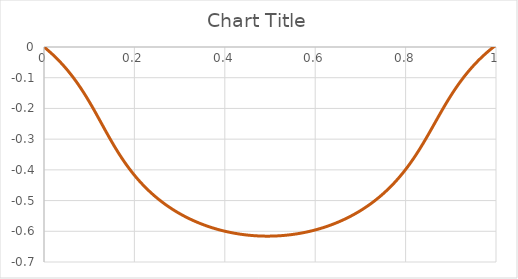
| Category | Series 0 |
|---|---|
| 0.0 | 0 |
| 0.001 | -0.001 |
| 0.002 | -0.002 |
| 0.003 | -0.004 |
| 0.004 | -0.005 |
| 0.005 | -0.006 |
| 0.006 | -0.007 |
| 0.007 | -0.009 |
| 0.008 | -0.01 |
| 0.009000000000000001 | -0.011 |
| 0.01 | -0.012 |
| 0.011 | -0.014 |
| 0.012 | -0.015 |
| 0.013000000000000001 | -0.016 |
| 0.014 | -0.018 |
| 0.015 | -0.019 |
| 0.016 | -0.02 |
| 0.017 | -0.022 |
| 0.018000000000000002 | -0.023 |
| 0.019 | -0.024 |
| 0.02 | -0.026 |
| 0.021 | -0.027 |
| 0.022 | -0.028 |
| 0.023 | -0.03 |
| 0.024 | -0.031 |
| 0.025 | -0.033 |
| 0.026000000000000002 | -0.034 |
| 0.027 | -0.036 |
| 0.028 | -0.037 |
| 0.029 | -0.038 |
| 0.03 | -0.04 |
| 0.031 | -0.041 |
| 0.032 | -0.043 |
| 0.033 | -0.045 |
| 0.034 | -0.046 |
| 0.035 | -0.048 |
| 0.036000000000000004 | -0.049 |
| 0.037 | -0.051 |
| 0.038 | -0.052 |
| 0.039 | -0.054 |
| 0.04 | -0.055 |
| 0.041 | -0.057 |
| 0.042 | -0.059 |
| 0.043000000000000003 | -0.06 |
| 0.044 | -0.062 |
| 0.045 | -0.064 |
| 0.046 | -0.065 |
| 0.047 | -0.067 |
| 0.048 | -0.069 |
| 0.049 | -0.07 |
| 0.05 | -0.072 |
| 0.051000000000000004 | -0.074 |
| 0.052000000000000005 | -0.076 |
| 0.053 | -0.078 |
| 0.054 | -0.079 |
| 0.055 | -0.081 |
| 0.056 | -0.083 |
| 0.057 | -0.085 |
| 0.058 | -0.087 |
| 0.059000000000000004 | -0.088 |
| 0.06 | -0.09 |
| 0.061 | -0.092 |
| 0.062 | -0.094 |
| 0.063 | -0.096 |
| 0.064 | -0.098 |
| 0.065 | -0.1 |
| 0.066 | -0.102 |
| 0.067 | -0.104 |
| 0.068 | -0.106 |
| 0.069 | -0.108 |
| 0.07 | -0.11 |
| 0.07100000000000001 | -0.112 |
| 0.07200000000000001 | -0.114 |
| 0.073 | -0.116 |
| 0.074 | -0.118 |
| 0.075 | -0.12 |
| 0.076 | -0.122 |
| 0.077 | -0.125 |
| 0.078 | -0.127 |
| 0.079 | -0.129 |
| 0.08 | -0.131 |
| 0.081 | -0.133 |
| 0.082 | -0.135 |
| 0.083 | -0.138 |
| 0.084 | -0.14 |
| 0.085 | -0.142 |
| 0.08600000000000001 | -0.144 |
| 0.08700000000000001 | -0.147 |
| 0.088 | -0.149 |
| 0.089 | -0.151 |
| 0.09 | -0.154 |
| 0.091 | -0.156 |
| 0.092 | -0.158 |
| 0.093 | -0.161 |
| 0.094 | -0.163 |
| 0.095 | -0.166 |
| 0.096 | -0.168 |
| 0.097 | -0.17 |
| 0.098 | -0.173 |
| 0.099 | -0.175 |
| 0.1 | -0.178 |
| 0.101 | -0.18 |
| 0.10200000000000001 | -0.183 |
| 0.10300000000000001 | -0.185 |
| 0.10400000000000001 | -0.188 |
| 0.105 | -0.19 |
| 0.106 | -0.193 |
| 0.107 | -0.196 |
| 0.108 | -0.198 |
| 0.109 | -0.201 |
| 0.11 | -0.203 |
| 0.111 | -0.206 |
| 0.112 | -0.208 |
| 0.113 | -0.211 |
| 0.114 | -0.214 |
| 0.115 | -0.216 |
| 0.116 | -0.219 |
| 0.117 | -0.222 |
| 0.11800000000000001 | -0.224 |
| 0.11900000000000001 | -0.227 |
| 0.12 | -0.23 |
| 0.121 | -0.232 |
| 0.122 | -0.235 |
| 0.123 | -0.238 |
| 0.124 | -0.24 |
| 0.125 | -0.243 |
| 0.126 | -0.246 |
| 0.127 | -0.248 |
| 0.128 | -0.251 |
| 0.129 | -0.254 |
| 0.13 | -0.256 |
| 0.131 | -0.259 |
| 0.132 | -0.262 |
| 0.133 | -0.264 |
| 0.134 | -0.267 |
| 0.135 | -0.27 |
| 0.136 | -0.272 |
| 0.137 | -0.275 |
| 0.138 | -0.278 |
| 0.139 | -0.28 |
| 0.14 | -0.283 |
| 0.14100000000000001 | -0.286 |
| 0.14200000000000002 | -0.288 |
| 0.14300000000000002 | -0.291 |
| 0.14400000000000002 | -0.293 |
| 0.145 | -0.296 |
| 0.146 | -0.299 |
| 0.147 | -0.301 |
| 0.148 | -0.304 |
| 0.149 | -0.306 |
| 0.15 | -0.309 |
| 0.151 | -0.311 |
| 0.152 | -0.314 |
| 0.153 | -0.316 |
| 0.154 | -0.319 |
| 0.155 | -0.321 |
| 0.156 | -0.324 |
| 0.157 | -0.326 |
| 0.158 | -0.329 |
| 0.159 | -0.331 |
| 0.16 | -0.334 |
| 0.161 | -0.336 |
| 0.162 | -0.338 |
| 0.163 | -0.341 |
| 0.164 | -0.343 |
| 0.165 | -0.345 |
| 0.166 | -0.348 |
| 0.167 | -0.35 |
| 0.168 | -0.352 |
| 0.169 | -0.355 |
| 0.17 | -0.357 |
| 0.171 | -0.359 |
| 0.17200000000000001 | -0.361 |
| 0.17300000000000001 | -0.364 |
| 0.17400000000000002 | -0.366 |
| 0.17500000000000002 | -0.368 |
| 0.176 | -0.37 |
| 0.177 | -0.372 |
| 0.178 | -0.374 |
| 0.179 | -0.376 |
| 0.18 | -0.379 |
| 0.181 | -0.381 |
| 0.182 | -0.383 |
| 0.183 | -0.385 |
| 0.184 | -0.387 |
| 0.185 | -0.389 |
| 0.186 | -0.391 |
| 0.187 | -0.393 |
| 0.188 | -0.395 |
| 0.189 | -0.397 |
| 0.19 | -0.399 |
| 0.191 | -0.401 |
| 0.192 | -0.403 |
| 0.193 | -0.404 |
| 0.194 | -0.406 |
| 0.195 | -0.408 |
| 0.196 | -0.41 |
| 0.197 | -0.412 |
| 0.198 | -0.414 |
| 0.199 | -0.416 |
| 0.2 | -0.417 |
| 0.201 | -0.419 |
| 0.202 | -0.421 |
| 0.203 | -0.423 |
| 0.20400000000000001 | -0.424 |
| 0.20500000000000002 | -0.426 |
| 0.20600000000000002 | -0.428 |
| 0.20700000000000002 | -0.43 |
| 0.20800000000000002 | -0.431 |
| 0.209 | -0.433 |
| 0.21 | -0.435 |
| 0.211 | -0.436 |
| 0.212 | -0.438 |
| 0.213 | -0.44 |
| 0.214 | -0.441 |
| 0.215 | -0.443 |
| 0.216 | -0.444 |
| 0.217 | -0.446 |
| 0.218 | -0.447 |
| 0.219 | -0.449 |
| 0.22 | -0.451 |
| 0.221 | -0.452 |
| 0.222 | -0.454 |
| 0.223 | -0.455 |
| 0.224 | -0.457 |
| 0.225 | -0.458 |
| 0.226 | -0.46 |
| 0.227 | -0.461 |
| 0.228 | -0.462 |
| 0.229 | -0.464 |
| 0.23 | -0.465 |
| 0.231 | -0.467 |
| 0.232 | -0.468 |
| 0.233 | -0.469 |
| 0.234 | -0.471 |
| 0.23500000000000001 | -0.472 |
| 0.23600000000000002 | -0.474 |
| 0.23700000000000002 | -0.475 |
| 0.23800000000000002 | -0.476 |
| 0.23900000000000002 | -0.478 |
| 0.24 | -0.479 |
| 0.241 | -0.48 |
| 0.242 | -0.482 |
| 0.243 | -0.483 |
| 0.244 | -0.484 |
| 0.245 | -0.485 |
| 0.246 | -0.487 |
| 0.247 | -0.488 |
| 0.248 | -0.489 |
| 0.249 | -0.49 |
| 0.25 | -0.492 |
| 0.251 | -0.493 |
| 0.252 | -0.494 |
| 0.253 | -0.495 |
| 0.254 | -0.496 |
| 0.255 | -0.498 |
| 0.256 | -0.499 |
| 0.257 | -0.5 |
| 0.258 | -0.501 |
| 0.259 | -0.502 |
| 0.26 | -0.503 |
| 0.261 | -0.504 |
| 0.262 | -0.506 |
| 0.263 | -0.507 |
| 0.264 | -0.508 |
| 0.265 | -0.509 |
| 0.266 | -0.51 |
| 0.267 | -0.511 |
| 0.268 | -0.512 |
| 0.269 | -0.513 |
| 0.27 | -0.514 |
| 0.271 | -0.515 |
| 0.272 | -0.516 |
| 0.273 | -0.517 |
| 0.274 | -0.518 |
| 0.275 | -0.519 |
| 0.276 | -0.52 |
| 0.277 | -0.521 |
| 0.278 | -0.522 |
| 0.279 | -0.523 |
| 0.28 | -0.524 |
| 0.281 | -0.525 |
| 0.28200000000000003 | -0.526 |
| 0.28300000000000003 | -0.527 |
| 0.28400000000000003 | -0.528 |
| 0.28500000000000003 | -0.529 |
| 0.28600000000000003 | -0.53 |
| 0.28700000000000003 | -0.531 |
| 0.28800000000000003 | -0.532 |
| 0.289 | -0.533 |
| 0.29 | -0.534 |
| 0.291 | -0.535 |
| 0.292 | -0.535 |
| 0.293 | -0.536 |
| 0.294 | -0.537 |
| 0.295 | -0.538 |
| 0.296 | -0.539 |
| 0.297 | -0.54 |
| 0.298 | -0.541 |
| 0.299 | -0.542 |
| 0.3 | -0.542 |
| 0.301 | -0.543 |
| 0.302 | -0.544 |
| 0.303 | -0.545 |
| 0.304 | -0.546 |
| 0.305 | -0.546 |
| 0.306 | -0.547 |
| 0.307 | -0.548 |
| 0.308 | -0.549 |
| 0.309 | -0.55 |
| 0.31 | -0.55 |
| 0.311 | -0.551 |
| 0.312 | -0.552 |
| 0.313 | -0.553 |
| 0.314 | -0.553 |
| 0.315 | -0.554 |
| 0.316 | -0.555 |
| 0.317 | -0.556 |
| 0.318 | -0.556 |
| 0.319 | -0.557 |
| 0.32 | -0.558 |
| 0.321 | -0.559 |
| 0.322 | -0.559 |
| 0.323 | -0.56 |
| 0.324 | -0.561 |
| 0.325 | -0.561 |
| 0.326 | -0.562 |
| 0.327 | -0.563 |
| 0.328 | -0.563 |
| 0.329 | -0.564 |
| 0.33 | -0.565 |
| 0.331 | -0.565 |
| 0.332 | -0.566 |
| 0.333 | -0.567 |
| 0.334 | -0.567 |
| 0.335 | -0.568 |
| 0.336 | -0.569 |
| 0.337 | -0.569 |
| 0.338 | -0.57 |
| 0.339 | -0.571 |
| 0.34 | -0.571 |
| 0.341 | -0.572 |
| 0.342 | -0.572 |
| 0.343 | -0.573 |
| 0.34400000000000003 | -0.574 |
| 0.34500000000000003 | -0.574 |
| 0.34600000000000003 | -0.575 |
| 0.34700000000000003 | -0.575 |
| 0.34800000000000003 | -0.576 |
| 0.34900000000000003 | -0.577 |
| 0.35000000000000003 | -0.577 |
| 0.35100000000000003 | -0.578 |
| 0.352 | -0.578 |
| 0.353 | -0.579 |
| 0.354 | -0.579 |
| 0.355 | -0.58 |
| 0.356 | -0.58 |
| 0.357 | -0.581 |
| 0.358 | -0.581 |
| 0.359 | -0.582 |
| 0.36 | -0.583 |
| 0.361 | -0.583 |
| 0.362 | -0.584 |
| 0.363 | -0.584 |
| 0.364 | -0.585 |
| 0.365 | -0.585 |
| 0.366 | -0.586 |
| 0.367 | -0.586 |
| 0.368 | -0.587 |
| 0.369 | -0.587 |
| 0.37 | -0.587 |
| 0.371 | -0.588 |
| 0.372 | -0.588 |
| 0.373 | -0.589 |
| 0.374 | -0.589 |
| 0.375 | -0.59 |
| 0.376 | -0.59 |
| 0.377 | -0.591 |
| 0.378 | -0.591 |
| 0.379 | -0.592 |
| 0.38 | -0.592 |
| 0.381 | -0.592 |
| 0.382 | -0.593 |
| 0.383 | -0.593 |
| 0.384 | -0.594 |
| 0.385 | -0.594 |
| 0.386 | -0.595 |
| 0.387 | -0.595 |
| 0.388 | -0.595 |
| 0.389 | -0.596 |
| 0.39 | -0.596 |
| 0.391 | -0.596 |
| 0.392 | -0.597 |
| 0.393 | -0.597 |
| 0.394 | -0.598 |
| 0.395 | -0.598 |
| 0.396 | -0.598 |
| 0.397 | -0.599 |
| 0.398 | -0.599 |
| 0.399 | -0.599 |
| 0.4 | -0.6 |
| 0.401 | -0.6 |
| 0.402 | -0.6 |
| 0.403 | -0.601 |
| 0.404 | -0.601 |
| 0.405 | -0.601 |
| 0.406 | -0.602 |
| 0.40700000000000003 | -0.602 |
| 0.40800000000000003 | -0.602 |
| 0.40900000000000003 | -0.603 |
| 0.41000000000000003 | -0.603 |
| 0.41100000000000003 | -0.603 |
| 0.41200000000000003 | -0.604 |
| 0.41300000000000003 | -0.604 |
| 0.41400000000000003 | -0.604 |
| 0.41500000000000004 | -0.605 |
| 0.41600000000000004 | -0.605 |
| 0.417 | -0.605 |
| 0.418 | -0.605 |
| 0.419 | -0.606 |
| 0.42 | -0.606 |
| 0.421 | -0.606 |
| 0.422 | -0.606 |
| 0.423 | -0.607 |
| 0.424 | -0.607 |
| 0.425 | -0.607 |
| 0.426 | -0.607 |
| 0.427 | -0.608 |
| 0.428 | -0.608 |
| 0.429 | -0.608 |
| 0.43 | -0.608 |
| 0.431 | -0.609 |
| 0.432 | -0.609 |
| 0.433 | -0.609 |
| 0.434 | -0.609 |
| 0.435 | -0.61 |
| 0.436 | -0.61 |
| 0.437 | -0.61 |
| 0.438 | -0.61 |
| 0.439 | -0.61 |
| 0.44 | -0.611 |
| 0.441 | -0.611 |
| 0.442 | -0.611 |
| 0.443 | -0.611 |
| 0.444 | -0.611 |
| 0.445 | -0.611 |
| 0.446 | -0.612 |
| 0.447 | -0.612 |
| 0.448 | -0.612 |
| 0.449 | -0.612 |
| 0.45 | -0.612 |
| 0.451 | -0.612 |
| 0.452 | -0.613 |
| 0.453 | -0.613 |
| 0.454 | -0.613 |
| 0.455 | -0.613 |
| 0.456 | -0.613 |
| 0.457 | -0.613 |
| 0.458 | -0.613 |
| 0.459 | -0.614 |
| 0.46 | -0.614 |
| 0.461 | -0.614 |
| 0.462 | -0.614 |
| 0.463 | -0.614 |
| 0.464 | -0.614 |
| 0.465 | -0.614 |
| 0.466 | -0.614 |
| 0.467 | -0.614 |
| 0.468 | -0.615 |
| 0.46900000000000003 | -0.615 |
| 0.47000000000000003 | -0.615 |
| 0.47100000000000003 | -0.615 |
| 0.47200000000000003 | -0.615 |
| 0.47300000000000003 | -0.615 |
| 0.47400000000000003 | -0.615 |
| 0.47500000000000003 | -0.615 |
| 0.47600000000000003 | -0.615 |
| 0.47700000000000004 | -0.615 |
| 0.47800000000000004 | -0.615 |
| 0.47900000000000004 | -0.615 |
| 0.48 | -0.615 |
| 0.481 | -0.616 |
| 0.482 | -0.616 |
| 0.483 | -0.616 |
| 0.484 | -0.616 |
| 0.485 | -0.616 |
| 0.486 | -0.616 |
| 0.487 | -0.616 |
| 0.488 | -0.616 |
| 0.489 | -0.616 |
| 0.49 | -0.616 |
| 0.491 | -0.616 |
| 0.492 | -0.616 |
| 0.493 | -0.616 |
| 0.494 | -0.616 |
| 0.495 | -0.616 |
| 0.496 | -0.616 |
| 0.497 | -0.616 |
| 0.498 | -0.616 |
| 0.499 | -0.616 |
| 0.5 | -0.616 |
| 0.501 | -0.616 |
| 0.502 | -0.616 |
| 0.503 | -0.616 |
| 0.504 | -0.616 |
| 0.505 | -0.616 |
| 0.506 | -0.616 |
| 0.507 | -0.616 |
| 0.508 | -0.615 |
| 0.509 | -0.615 |
| 0.51 | -0.615 |
| 0.511 | -0.615 |
| 0.512 | -0.615 |
| 0.513 | -0.615 |
| 0.514 | -0.615 |
| 0.515 | -0.615 |
| 0.516 | -0.615 |
| 0.517 | -0.615 |
| 0.518 | -0.615 |
| 0.519 | -0.615 |
| 0.52 | -0.615 |
| 0.521 | -0.615 |
| 0.522 | -0.614 |
| 0.523 | -0.614 |
| 0.524 | -0.614 |
| 0.525 | -0.614 |
| 0.526 | -0.614 |
| 0.527 | -0.614 |
| 0.528 | -0.614 |
| 0.529 | -0.614 |
| 0.53 | -0.614 |
| 0.531 | -0.613 |
| 0.532 | -0.613 |
| 0.533 | -0.613 |
| 0.534 | -0.613 |
| 0.535 | -0.613 |
| 0.536 | -0.613 |
| 0.537 | -0.613 |
| 0.538 | -0.612 |
| 0.539 | -0.612 |
| 0.54 | -0.612 |
| 0.541 | -0.612 |
| 0.542 | -0.612 |
| 0.543 | -0.612 |
| 0.544 | -0.611 |
| 0.545 | -0.611 |
| 0.546 | -0.611 |
| 0.547 | -0.611 |
| 0.548 | -0.611 |
| 0.549 | -0.611 |
| 0.55 | -0.61 |
| 0.551 | -0.61 |
| 0.552 | -0.61 |
| 0.553 | -0.61 |
| 0.554 | -0.61 |
| 0.555 | -0.609 |
| 0.556 | -0.609 |
| 0.557 | -0.609 |
| 0.558 | -0.609 |
| 0.559 | -0.608 |
| 0.56 | -0.608 |
| 0.561 | -0.608 |
| 0.562 | -0.608 |
| 0.5630000000000001 | -0.607 |
| 0.5640000000000001 | -0.607 |
| 0.5650000000000001 | -0.607 |
| 0.5660000000000001 | -0.607 |
| 0.5670000000000001 | -0.606 |
| 0.5680000000000001 | -0.606 |
| 0.5690000000000001 | -0.606 |
| 0.5700000000000001 | -0.606 |
| 0.5710000000000001 | -0.605 |
| 0.5720000000000001 | -0.605 |
| 0.5730000000000001 | -0.605 |
| 0.5740000000000001 | -0.604 |
| 0.5750000000000001 | -0.604 |
| 0.5760000000000001 | -0.604 |
| 0.577 | -0.604 |
| 0.578 | -0.603 |
| 0.579 | -0.603 |
| 0.58 | -0.603 |
| 0.581 | -0.602 |
| 0.582 | -0.602 |
| 0.583 | -0.602 |
| 0.584 | -0.601 |
| 0.585 | -0.601 |
| 0.586 | -0.601 |
| 0.587 | -0.6 |
| 0.588 | -0.6 |
| 0.589 | -0.6 |
| 0.59 | -0.599 |
| 0.591 | -0.599 |
| 0.592 | -0.599 |
| 0.593 | -0.598 |
| 0.594 | -0.598 |
| 0.595 | -0.598 |
| 0.596 | -0.597 |
| 0.597 | -0.597 |
| 0.598 | -0.596 |
| 0.599 | -0.596 |
| 0.6 | -0.596 |
| 0.601 | -0.595 |
| 0.602 | -0.595 |
| 0.603 | -0.594 |
| 0.604 | -0.594 |
| 0.605 | -0.594 |
| 0.606 | -0.593 |
| 0.607 | -0.593 |
| 0.608 | -0.592 |
| 0.609 | -0.592 |
| 0.61 | -0.592 |
| 0.611 | -0.591 |
| 0.612 | -0.591 |
| 0.613 | -0.59 |
| 0.614 | -0.59 |
| 0.615 | -0.589 |
| 0.616 | -0.589 |
| 0.617 | -0.588 |
| 0.618 | -0.588 |
| 0.619 | -0.587 |
| 0.62 | -0.587 |
| 0.621 | -0.586 |
| 0.622 | -0.586 |
| 0.623 | -0.586 |
| 0.624 | -0.585 |
| 0.625 | -0.585 |
| 0.626 | -0.584 |
| 0.627 | -0.584 |
| 0.628 | -0.583 |
| 0.629 | -0.582 |
| 0.63 | -0.582 |
| 0.631 | -0.581 |
| 0.632 | -0.581 |
| 0.633 | -0.58 |
| 0.634 | -0.58 |
| 0.635 | -0.579 |
| 0.636 | -0.579 |
| 0.637 | -0.578 |
| 0.638 | -0.578 |
| 0.639 | -0.577 |
| 0.64 | -0.577 |
| 0.641 | -0.576 |
| 0.642 | -0.575 |
| 0.643 | -0.575 |
| 0.644 | -0.574 |
| 0.645 | -0.574 |
| 0.646 | -0.573 |
| 0.647 | -0.572 |
| 0.648 | -0.572 |
| 0.649 | -0.571 |
| 0.65 | -0.571 |
| 0.651 | -0.57 |
| 0.652 | -0.569 |
| 0.653 | -0.569 |
| 0.654 | -0.568 |
| 0.655 | -0.567 |
| 0.656 | -0.567 |
| 0.657 | -0.566 |
| 0.658 | -0.565 |
| 0.659 | -0.565 |
| 0.66 | -0.564 |
| 0.661 | -0.563 |
| 0.662 | -0.563 |
| 0.663 | -0.562 |
| 0.664 | -0.561 |
| 0.665 | -0.561 |
| 0.666 | -0.56 |
| 0.667 | -0.559 |
| 0.668 | -0.559 |
| 0.669 | -0.558 |
| 0.67 | -0.557 |
| 0.671 | -0.556 |
| 0.672 | -0.556 |
| 0.673 | -0.555 |
| 0.674 | -0.554 |
| 0.675 | -0.554 |
| 0.676 | -0.553 |
| 0.677 | -0.552 |
| 0.678 | -0.551 |
| 0.679 | -0.55 |
| 0.68 | -0.55 |
| 0.681 | -0.549 |
| 0.682 | -0.548 |
| 0.683 | -0.547 |
| 0.684 | -0.547 |
| 0.685 | -0.546 |
| 0.686 | -0.545 |
| 0.687 | -0.544 |
| 0.6880000000000001 | -0.543 |
| 0.6890000000000001 | -0.542 |
| 0.6900000000000001 | -0.542 |
| 0.6910000000000001 | -0.541 |
| 0.6920000000000001 | -0.54 |
| 0.6930000000000001 | -0.539 |
| 0.6940000000000001 | -0.538 |
| 0.6950000000000001 | -0.537 |
| 0.6960000000000001 | -0.536 |
| 0.6970000000000001 | -0.536 |
| 0.6980000000000001 | -0.535 |
| 0.6990000000000001 | -0.534 |
| 0.7000000000000001 | -0.533 |
| 0.7010000000000001 | -0.532 |
| 0.7020000000000001 | -0.531 |
| 0.7030000000000001 | -0.53 |
| 0.704 | -0.529 |
| 0.705 | -0.528 |
| 0.706 | -0.527 |
| 0.707 | -0.526 |
| 0.708 | -0.525 |
| 0.709 | -0.524 |
| 0.71 | -0.523 |
| 0.711 | -0.523 |
| 0.712 | -0.522 |
| 0.713 | -0.521 |
| 0.714 | -0.52 |
| 0.715 | -0.519 |
| 0.716 | -0.518 |
| 0.717 | -0.516 |
| 0.718 | -0.515 |
| 0.719 | -0.514 |
| 0.72 | -0.513 |
| 0.721 | -0.512 |
| 0.722 | -0.511 |
| 0.723 | -0.51 |
| 0.724 | -0.509 |
| 0.725 | -0.508 |
| 0.726 | -0.507 |
| 0.727 | -0.506 |
| 0.728 | -0.505 |
| 0.729 | -0.504 |
| 0.73 | -0.503 |
| 0.731 | -0.501 |
| 0.732 | -0.5 |
| 0.733 | -0.499 |
| 0.734 | -0.498 |
| 0.735 | -0.497 |
| 0.736 | -0.496 |
| 0.737 | -0.494 |
| 0.738 | -0.493 |
| 0.739 | -0.492 |
| 0.74 | -0.491 |
| 0.741 | -0.49 |
| 0.742 | -0.488 |
| 0.743 | -0.487 |
| 0.744 | -0.486 |
| 0.745 | -0.485 |
| 0.746 | -0.483 |
| 0.747 | -0.482 |
| 0.748 | -0.481 |
| 0.749 | -0.48 |
| 0.75 | -0.478 |
| 0.751 | -0.477 |
| 0.752 | -0.476 |
| 0.753 | -0.474 |
| 0.754 | -0.473 |
| 0.755 | -0.472 |
| 0.756 | -0.47 |
| 0.757 | -0.469 |
| 0.758 | -0.467 |
| 0.759 | -0.466 |
| 0.76 | -0.465 |
| 0.761 | -0.463 |
| 0.762 | -0.462 |
| 0.763 | -0.46 |
| 0.764 | -0.459 |
| 0.765 | -0.457 |
| 0.766 | -0.456 |
| 0.767 | -0.454 |
| 0.768 | -0.453 |
| 0.769 | -0.452 |
| 0.77 | -0.45 |
| 0.771 | -0.448 |
| 0.772 | -0.447 |
| 0.773 | -0.445 |
| 0.774 | -0.444 |
| 0.775 | -0.442 |
| 0.776 | -0.441 |
| 0.777 | -0.439 |
| 0.778 | -0.437 |
| 0.779 | -0.436 |
| 0.78 | -0.434 |
| 0.781 | -0.433 |
| 0.782 | -0.431 |
| 0.783 | -0.429 |
| 0.784 | -0.428 |
| 0.785 | -0.426 |
| 0.786 | -0.424 |
| 0.787 | -0.422 |
| 0.788 | -0.421 |
| 0.789 | -0.419 |
| 0.79 | -0.417 |
| 0.791 | -0.415 |
| 0.792 | -0.414 |
| 0.793 | -0.412 |
| 0.794 | -0.41 |
| 0.795 | -0.408 |
| 0.796 | -0.406 |
| 0.797 | -0.404 |
| 0.798 | -0.403 |
| 0.799 | -0.401 |
| 0.8 | -0.399 |
| 0.801 | -0.397 |
| 0.802 | -0.395 |
| 0.803 | -0.393 |
| 0.804 | -0.391 |
| 0.805 | -0.389 |
| 0.806 | -0.387 |
| 0.807 | -0.385 |
| 0.808 | -0.383 |
| 0.809 | -0.381 |
| 0.81 | -0.379 |
| 0.811 | -0.377 |
| 0.812 | -0.375 |
| 0.8130000000000001 | -0.373 |
| 0.8140000000000001 | -0.371 |
| 0.8150000000000001 | -0.368 |
| 0.8160000000000001 | -0.366 |
| 0.8170000000000001 | -0.364 |
| 0.8180000000000001 | -0.362 |
| 0.8190000000000001 | -0.36 |
| 0.8200000000000001 | -0.358 |
| 0.8210000000000001 | -0.355 |
| 0.8220000000000001 | -0.353 |
| 0.8230000000000001 | -0.351 |
| 0.8240000000000001 | -0.349 |
| 0.8250000000000001 | -0.346 |
| 0.8260000000000001 | -0.344 |
| 0.8270000000000001 | -0.342 |
| 0.8280000000000001 | -0.34 |
| 0.8290000000000001 | -0.337 |
| 0.8300000000000001 | -0.335 |
| 0.8310000000000001 | -0.333 |
| 0.8320000000000001 | -0.33 |
| 0.833 | -0.328 |
| 0.834 | -0.325 |
| 0.835 | -0.323 |
| 0.836 | -0.321 |
| 0.837 | -0.318 |
| 0.838 | -0.316 |
| 0.839 | -0.313 |
| 0.84 | -0.311 |
| 0.841 | -0.308 |
| 0.842 | -0.306 |
| 0.843 | -0.303 |
| 0.844 | -0.301 |
| 0.845 | -0.298 |
| 0.846 | -0.296 |
| 0.847 | -0.293 |
| 0.848 | -0.291 |
| 0.849 | -0.288 |
| 0.85 | -0.286 |
| 0.851 | -0.283 |
| 0.852 | -0.28 |
| 0.853 | -0.278 |
| 0.854 | -0.275 |
| 0.855 | -0.273 |
| 0.856 | -0.27 |
| 0.857 | -0.267 |
| 0.858 | -0.265 |
| 0.859 | -0.262 |
| 0.86 | -0.26 |
| 0.861 | -0.257 |
| 0.862 | -0.254 |
| 0.863 | -0.252 |
| 0.864 | -0.249 |
| 0.865 | -0.247 |
| 0.866 | -0.244 |
| 0.867 | -0.241 |
| 0.868 | -0.239 |
| 0.869 | -0.236 |
| 0.87 | -0.233 |
| 0.871 | -0.231 |
| 0.872 | -0.228 |
| 0.873 | -0.226 |
| 0.874 | -0.223 |
| 0.875 | -0.22 |
| 0.876 | -0.218 |
| 0.877 | -0.215 |
| 0.878 | -0.213 |
| 0.879 | -0.21 |
| 0.88 | -0.208 |
| 0.881 | -0.205 |
| 0.882 | -0.203 |
| 0.883 | -0.2 |
| 0.884 | -0.198 |
| 0.885 | -0.195 |
| 0.886 | -0.193 |
| 0.887 | -0.19 |
| 0.888 | -0.188 |
| 0.889 | -0.185 |
| 0.89 | -0.183 |
| 0.891 | -0.18 |
| 0.892 | -0.178 |
| 0.893 | -0.175 |
| 0.894 | -0.173 |
| 0.895 | -0.171 |
| 0.896 | -0.168 |
| 0.897 | -0.166 |
| 0.898 | -0.163 |
| 0.899 | -0.161 |
| 0.9 | -0.159 |
| 0.901 | -0.156 |
| 0.902 | -0.154 |
| 0.903 | -0.152 |
| 0.904 | -0.15 |
| 0.905 | -0.147 |
| 0.906 | -0.145 |
| 0.907 | -0.143 |
| 0.908 | -0.141 |
| 0.909 | -0.138 |
| 0.91 | -0.136 |
| 0.911 | -0.134 |
| 0.912 | -0.132 |
| 0.913 | -0.13 |
| 0.914 | -0.128 |
| 0.915 | -0.126 |
| 0.916 | -0.123 |
| 0.917 | -0.121 |
| 0.918 | -0.119 |
| 0.919 | -0.117 |
| 0.92 | -0.115 |
| 0.921 | -0.113 |
| 0.922 | -0.111 |
| 0.923 | -0.109 |
| 0.924 | -0.107 |
| 0.925 | -0.105 |
| 0.926 | -0.103 |
| 0.927 | -0.101 |
| 0.928 | -0.1 |
| 0.929 | -0.098 |
| 0.93 | -0.096 |
| 0.931 | -0.094 |
| 0.932 | -0.092 |
| 0.933 | -0.09 |
| 0.934 | -0.088 |
| 0.935 | -0.087 |
| 0.936 | -0.085 |
| 0.937 | -0.083 |
| 0.9380000000000001 | -0.081 |
| 0.9390000000000001 | -0.079 |
| 0.9400000000000001 | -0.078 |
| 0.9410000000000001 | -0.076 |
| 0.9420000000000001 | -0.074 |
| 0.9430000000000001 | -0.073 |
| 0.9440000000000001 | -0.071 |
| 0.9450000000000001 | -0.069 |
| 0.9460000000000001 | -0.067 |
| 0.9470000000000001 | -0.066 |
| 0.9480000000000001 | -0.064 |
| 0.9490000000000001 | -0.063 |
| 0.9500000000000001 | -0.061 |
| 0.9510000000000001 | -0.059 |
| 0.9520000000000001 | -0.058 |
| 0.9530000000000001 | -0.056 |
| 0.9540000000000001 | -0.055 |
| 0.9550000000000001 | -0.053 |
| 0.9560000000000001 | -0.051 |
| 0.9570000000000001 | -0.05 |
| 0.9580000000000001 | -0.048 |
| 0.9590000000000001 | -0.047 |
| 0.96 | -0.045 |
| 0.961 | -0.044 |
| 0.962 | -0.042 |
| 0.963 | -0.041 |
| 0.964 | -0.04 |
| 0.965 | -0.038 |
| 0.966 | -0.037 |
| 0.967 | -0.035 |
| 0.968 | -0.034 |
| 0.969 | -0.032 |
| 0.97 | -0.031 |
| 0.971 | -0.03 |
| 0.972 | -0.028 |
| 0.973 | -0.027 |
| 0.974 | -0.026 |
| 0.975 | -0.024 |
| 0.976 | -0.023 |
| 0.977 | -0.022 |
| 0.978 | -0.02 |
| 0.979 | -0.019 |
| 0.98 | -0.018 |
| 0.981 | -0.016 |
| 0.982 | -0.015 |
| 0.983 | -0.014 |
| 0.984 | -0.013 |
| 0.985 | -0.011 |
| 0.986 | -0.01 |
| 0.987 | -0.009 |
| 0.988 | -0.008 |
| 0.989 | -0.007 |
| 0.99 | -0.005 |
| 0.991 | -0.004 |
| 0.992 | -0.003 |
| 0.993 | -0.002 |
| 0.994 | -0.001 |
| 0.995 | 0 |
| 0.996 | 0.002 |
| 0.997 | 0.003 |
| 0.998 | 0.004 |
| 0.999 | 0.005 |